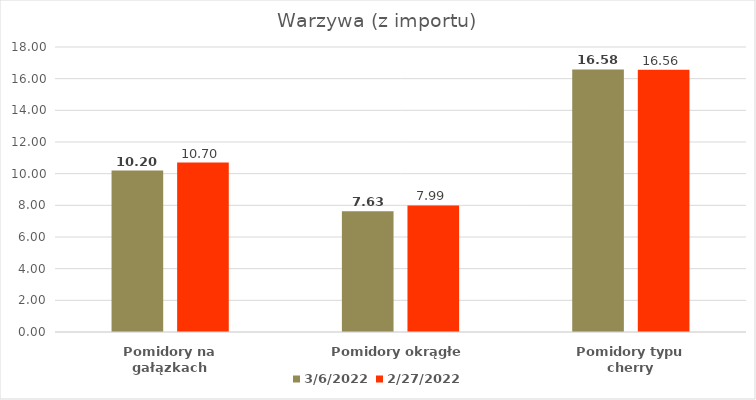
| Category | 06.03.2022 | 27.02.2022 |
|---|---|---|
| Pomidory na gałązkach | 10.2 | 10.7 |
| Pomidory okrągłe | 7.63 | 7.99 |
| Pomidory typu cherry | 16.58 | 16.56 |